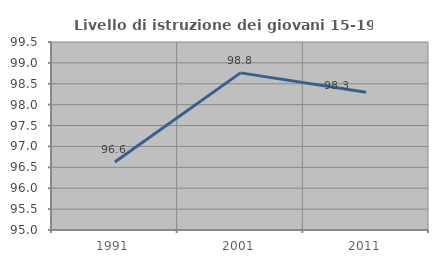
| Category | Livello di istruzione dei giovani 15-19 anni |
|---|---|
| 1991.0 | 96.629 |
| 2001.0 | 98.761 |
| 2011.0 | 98.295 |